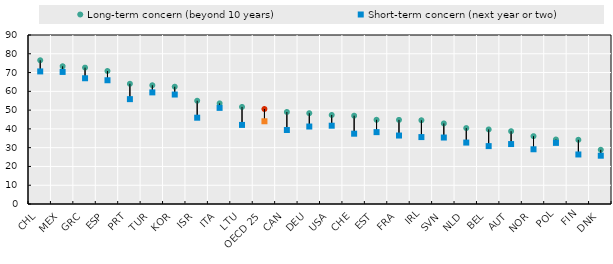
| Category | Long-term concern (beyond 10 years) | Short-term concern (next year or two) |
|---|---|---|
| CHL | 76.533 | 70.606 |
| MEX | 73.349 | 70.333 |
| GRC | 72.631 | 66.969 |
| ESP | 70.827 | 65.903 |
| PRT | 64.025 | 55.842 |
| TUR | 63.243 | 59.443 |
| KOR | 62.456 | 58.299 |
| ISR | 54.986 | 45.955 |
| ITA | 53.59 | 51.198 |
| LTU | 51.703 | 42.115 |
| OECD 25 | 50.589 | 44.059 |
| CAN | 49.005 | 39.404 |
| DEU | 48.357 | 41.257 |
| USA | 47.413 | 41.695 |
| CHE | 47.032 | 37.441 |
| EST | 44.843 | 38.268 |
| FRA | 44.805 | 36.463 |
| IRL | 44.597 | 35.635 |
| SVN | 42.9 | 35.397 |
| NLD | 40.432 | 32.712 |
| BEL | 39.713 | 30.827 |
| AUT | 38.767 | 31.916 |
| NOR | 36.123 | 29.152 |
| POL | 34.344 | 32.548 |
| FIN | 34.179 | 26.38 |
| DNK | 28.87 | 25.722 |